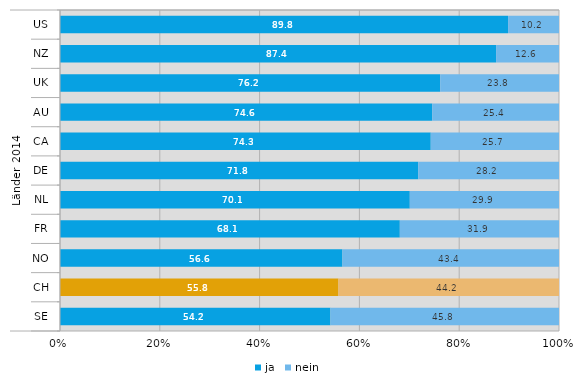
| Category | ja | nein |
|---|---|---|
| 0 | 89.8 | 10.2 |
| 1 | 87.4 | 12.6 |
| 2 | 76.2 | 23.8 |
| 3 | 74.6 | 25.4 |
| 4 | 74.3 | 25.7 |
| 5 | 71.8 | 28.2 |
| 6 | 70.1 | 29.9 |
| 7 | 68.1 | 31.9 |
| 8 | 56.6 | 43.4 |
| 9 | 55.8 | 44.2 |
| 10 | 54.2 | 45.8 |